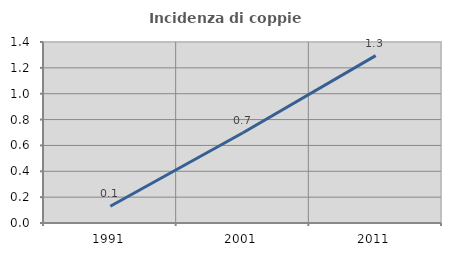
| Category | Incidenza di coppie miste |
|---|---|
| 1991.0 | 0.13 |
| 2001.0 | 0.698 |
| 2011.0 | 1.294 |